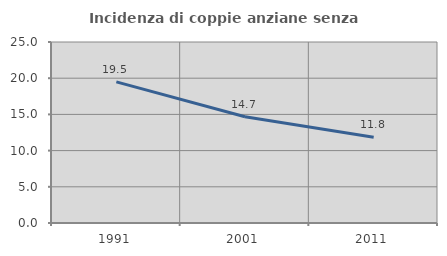
| Category | Incidenza di coppie anziane senza figli  |
|---|---|
| 1991.0 | 19.492 |
| 2001.0 | 14.667 |
| 2011.0 | 11.847 |